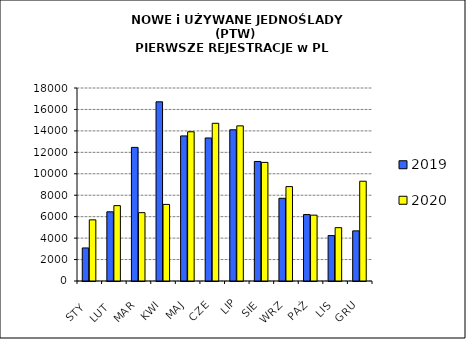
| Category | 2019 | 2020 |
|---|---|---|
|  STY  | 3082 | 5703 |
|  LUT  | 6453 | 7029 |
| MAR | 12461 | 6374 |
| KWI | 16711 | 7143 |
| MAJ | 13531 | 13918 |
| CZE | 13339 | 14709 |
| LIP | 14101 | 14468 |
| SIE | 11149 | 11062 |
| WRZ | 7714 | 8804 |
| PAŹ | 6197 | 6142 |
| LIS | 4236 | 4973 |
| GRU | 4676 | 9306 |